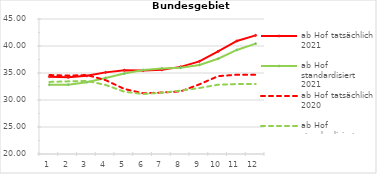
| Category | ab Hof tatsächlich 2021 | ab Hof standardisiert 2021 | ab Hof tatsächlich 2020 | ab Hof standardisiert 2020 |
|---|---|---|---|---|
| 0 | 34.321 | 32.829 | 34.621 | 33.348 |
| 1 | 34.198 | 32.824 | 34.518 | 33.453 |
| 2 | 34.473 | 33.306 | 34.628 | 33.535 |
| 3 | 35.116 | 34.084 | 33.677 | 32.789 |
| 4 | 35.508 | 34.904 | 32.039 | 31.533 |
| 5 | 35.447 | 35.552 | 31.246 | 31.111 |
| 6 | 35.585 | 35.851 | 31.379 | 31.356 |
| 7 | 36.134 | 35.971 | 31.6 | 31.735 |
| 8 | 37.156 | 36.5 | 32.897 | 32.223 |
| 9 | 39.013 | 37.635 | 34.413 | 32.83 |
| 10 | 40.927 | 39.269 | 34.683 | 32.957 |
| 11 | 41.97 | 40.442 | 34.679 | 32.955 |